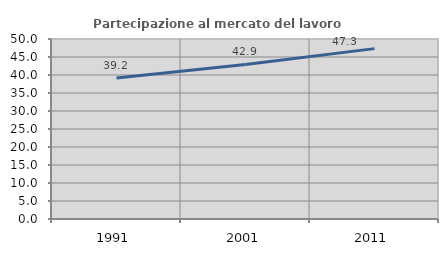
| Category | Partecipazione al mercato del lavoro  femminile |
|---|---|
| 1991.0 | 39.154 |
| 2001.0 | 42.925 |
| 2011.0 | 47.326 |